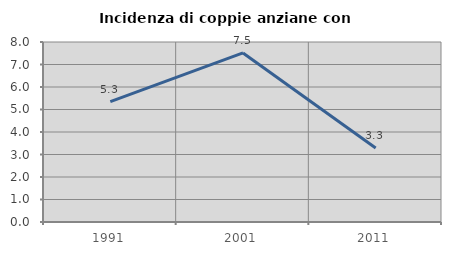
| Category | Incidenza di coppie anziane con figli |
|---|---|
| 1991.0 | 5.348 |
| 2001.0 | 7.514 |
| 2011.0 | 3.289 |